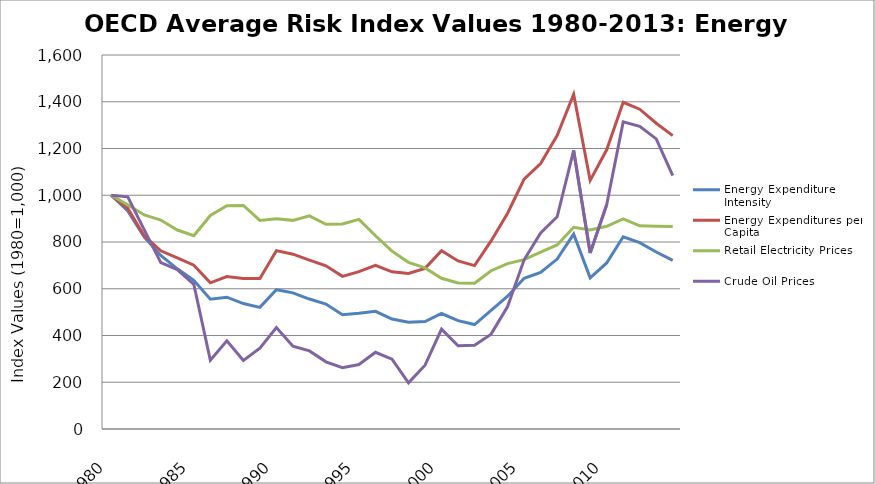
| Category | Energy Expenditure Intensity | Energy Expenditures per Capita | Retail Electricity Prices | Crude Oil Prices |
|---|---|---|---|---|
| 1980.0 | 1000 | 1000 | 1000 | 1000 |
| 1981.0 | 932.7 | 943.848 | 958.704 | 993.161 |
| 1982.0 | 820.746 | 825.932 | 915.675 | 851.876 |
| 1983.0 | 742.582 | 762.173 | 894.016 | 711.763 |
| 1984.0 | 685.133 | 732.202 | 851.299 | 682.178 |
| 1985.0 | 636.234 | 701.047 | 827.203 | 618.882 |
| 1986.0 | 554.967 | 625.218 | 913.276 | 293.93 |
| 1987.0 | 563.96 | 652.013 | 954.844 | 377.54 |
| 1988.0 | 536.594 | 644.142 | 956.313 | 293.506 |
| 1989.0 | 520.469 | 643.738 | 892.347 | 345.43 |
| 1990.0 | 596.09 | 763.028 | 899.617 | 434.161 |
| 1991.0 | 582.298 | 747.819 | 892.568 | 354.388 |
| 1992.0 | 555.934 | 722.263 | 911.979 | 334.04 |
| 1993.0 | 534.584 | 698.44 | 875.97 | 287.266 |
| 1994.0 | 488.618 | 653.117 | 876.902 | 262.265 |
| 1995.0 | 494.737 | 673.263 | 896.698 | 275.697 |
| 1996.0 | 503.226 | 700.029 | 826.757 | 328.341 |
| 1997.0 | 470.384 | 672.542 | 760.752 | 298.885 |
| 1998.0 | 456.378 | 665.103 | 712.933 | 197.426 |
| 1999.0 | 459.694 | 687.214 | 689.288 | 272.782 |
| 2000.0 | 494.034 | 762.476 | 644.699 | 427.038 |
| 2001.0 | 463.363 | 719.113 | 624.471 | 356.333 |
| 2002.0 | 446.73 | 699.091 | 624.04 | 358.553 |
| 2003.0 | 507.312 | 804.565 | 677.022 | 405.842 |
| 2004.0 | 567.869 | 923.154 | 707.343 | 523.812 |
| 2005.0 | 644.703 | 1068.888 | 724.335 | 723.816 |
| 2006.0 | 669.827 | 1135.701 | 756.783 | 838.521 |
| 2007.0 | 726.868 | 1255.733 | 787.401 | 908.042 |
| 2008.0 | 833.759 | 1431.82 | 862.902 | 1191.778 |
| 2009.0 | 646.659 | 1063.437 | 851.012 | 753.307 |
| 2010.0 | 710.292 | 1194.414 | 867.169 | 959.627 |
| 2011.0 | 822.216 | 1397.513 | 898.508 | 1314.007 |
| 2012.0 | 797.176 | 1368.066 | 868.994 | 1295.122 |
| 2013.0 | 757.16 | 1308.153 | 867.823 | 1241.013 |
| 2014.0 | 721.416 | 1254.961 | 866.654 | 1084.322 |